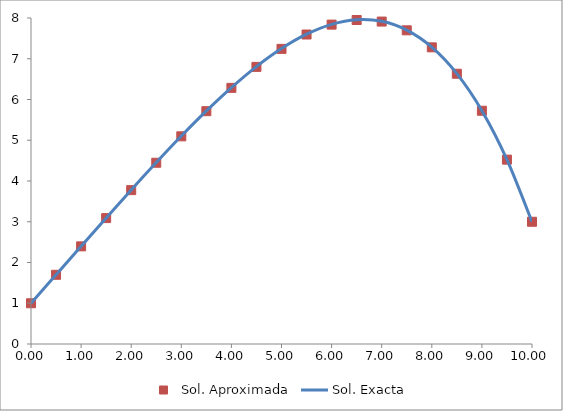
| Category | Sol. Aproximada |
|---|---|
| 0.0 | 1 |
| 0.5 | 1.699 |
| 1.0 | 2.396 |
| 1.5 | 3.09 |
| 2.0 | 3.776 |
| 2.5 | 4.448 |
| 3.0 | 5.097 |
| 3.5 | 5.713 |
| 4.0 | 6.286 |
| 4.5 | 6.8 |
| 5.0 | 7.242 |
| 5.5 | 7.595 |
| 6.0 | 7.838 |
| 6.5 | 7.951 |
| 7.0 | 7.912 |
| 7.5 | 7.698 |
| 8.0 | 7.28 |
| 8.5 | 6.632 |
| 9.0 | 5.724 |
| 9.5 | 4.524 |
| 10.0 | 3 |